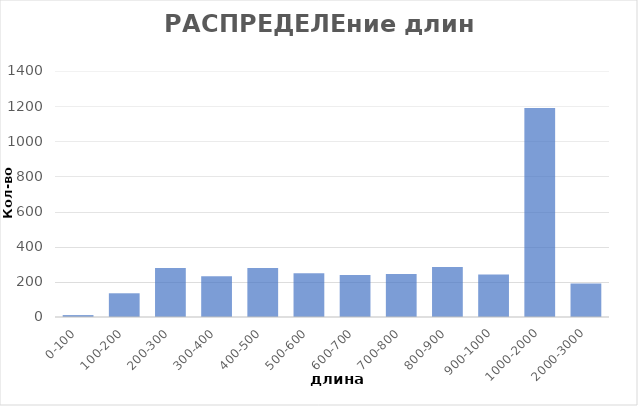
| Category | Series 0 |
|---|---|
| 0-100 | 11 |
| 100-200 | 135 |
| 200-300 | 279 |
| 300-400 | 232 |
| 400-500 | 279 |
| 500-600 | 249 |
| 600-700 | 239 |
| 700-800 | 245 |
| 800-900 | 285 |
| 900-1000 | 242 |
| 1000-2000 | 1189 |
| 2000-3000 | 191 |